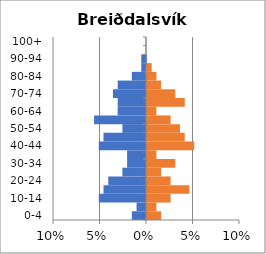
| Category | % Men | % Women |
|---|---|---|
| 0-4 | -0.015 | 0.015 |
| 5-9 | -0.01 | 0.01 |
| 10-14 | -0.051 | 0.025 |
| 15-19 | -0.046 | 0.046 |
| 20-24 | -0.041 | 0.025 |
| 25-29 | -0.025 | 0.015 |
| 30-34 | -0.02 | 0.03 |
| 35-39 | -0.02 | 0.01 |
| 40-44 | -0.051 | 0.051 |
| 45-49 | -0.046 | 0.041 |
| 50-54 | -0.025 | 0.036 |
| 55-59 | -0.056 | 0.025 |
| 60-64 | -0.03 | 0.01 |
| 65-69 | -0.03 | 0.041 |
| 70-74 | -0.036 | 0.03 |
| 75-79 | -0.03 | 0.015 |
| 80-84 | -0.015 | 0.01 |
| 85-89 | -0.005 | 0.005 |
| 90-94 | -0.005 | 0 |
| 95-99 | 0 | 0 |
| 100+ | 0 | 0 |